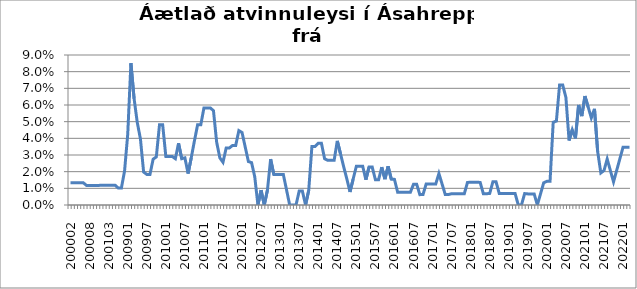
| Category | Series 0 |
|---|---|
| 200002 | 0.013 |
| 200003 | 0.013 |
| 200004 | 0.013 |
| 200005 | 0.013 |
| 200006 | 0.013 |
| 200007 | 0.012 |
| 200008 | 0.012 |
| 200010 | 0.012 |
| 200011 | 0.012 |
| 200012 | 0.012 |
| 200101 | 0.012 |
| 200102 | 0.012 |
| 200103 | 0.012 |
| 200104 | 0.012 |
| 200105 | 0.012 |
| 200810 | 0.01 |
| 200811 | 0.01 |
| 200812 | 0.02 |
| 200901 | 0.043 |
| 200902 | 0.085 |
| 200903 | 0.064 |
| 200904 | 0.05 |
| 200905 | 0.04 |
| 200906 | 0.02 |
| 200907 | 0.018 |
| 200908 | 0.018 |
| 200909 | 0.028 |
| 200910 | 0.029 |
| 200911 | 0.048 |
| 200912 | 0.048 |
| 201001 | 0.029 |
| 201002 | 0.029 |
| 201003 | 0.029 |
| 201004 | 0.028 |
| 201005 | 0.037 |
| 201006 | 0.028 |
| 201007 | 0.028 |
| 201008 | 0.019 |
| 201009 | 0.028 |
| 201010 | 0.038 |
| 201011 | 0.048 |
| 201012 | 0.048 |
| 201101 | 0.058 |
| 201102 | 0.058 |
| 201103 | 0.058 |
| 201104 | 0.057 |
| 201105 | 0.038 |
| 201106 | 0.028 |
| 201107 | 0.026 |
| 201108 | 0.034 |
| 201109 | 0.034 |
| 201110 | 0.036 |
| 201111 | 0.036 |
| 201112 | 0.045 |
| 201201 | 0.043 |
| 201202 | 0.035 |
| 201203 | 0.026 |
| 201204 | 0.025 |
| 201205 | 0.017 |
| 201206 | 0 |
| 201207 | 0.009 |
| 201208 | 0 |
| 201209 | 0.009 |
| 201210 | 0.028 |
| 201211 | 0.018 |
| 201212 | 0.018 |
| 201301 | 0.018 |
| 201302 | 0.018 |
| 201303 | 0.009 |
| 201304 | 0 |
| 201305 | 0 |
| 201306 | 0 |
| 201307 | 0.008 |
| 201308 | 0.008 |
| 201309 | 0 |
| 201310 | 0.009 |
| 201311 | 0.035 |
| 201312 | 0.035 |
| 201401 | 0.037 |
| 201402 | 0.037 |
| 201403 | 0.028 |
| 201404 | 0.027 |
| 201405 | 0.027 |
| 201406 | 0.027 |
| 201407 | 0.038 |
| 201408 | 0.031 |
| 201409 | 0.023 |
| 201410 | 0.016 |
| 201411 | 0.008 |
| 201412 | 0.016 |
| 201501 | 0.023 |
| 201502 | 0.023 |
| 201503 | 0.023 |
| 201504 | 0.015 |
| 201505 | 0.023 |
| 201506 | 0.023 |
| 201507 | 0.015 |
| 201508 | 0.015 |
| 201509 | 0.023 |
| 201510 | 0.016 |
| 201511 | 0.023 |
| 201512 | 0.016 |
| 201601 | 0.015 |
| 201602 | 0.008 |
| 201603 | 0.008 |
| 201604 | 0.008 |
| 201605 | 0.008 |
| 201606 | 0.008 |
| 201607 | 0.012 |
| 201608 | 0.012 |
| 201609 | 0.006 |
| 201610 | 0.006 |
| 201611 | 0.013 |
| 201612 | 0.013 |
| 201701 | 0.013 |
| 201702 | 0.013 |
| 201703 | 0.019 |
| 201704 | 0.013 |
| 201705 | 0.006 |
| 201706 | 0.006 |
| 201707 | 0.007 |
| 201708 | 0.007 |
| 201709 | 0.007 |
| 201710 | 0.007 |
| 201711 | 0.007 |
| 201712 | 0.014 |
| 201801 | 0.014 |
| 201802 | 0.014 |
| 201803 | 0.014 |
| 201804 | 0.014 |
| 201805 | 0.007 |
| 201806 | 0.007 |
| 201807 | 0.007 |
| 201808 | 0.014 |
| 201809 | 0.014 |
| 201810 | 0.007 |
| 201811 | 0.007 |
| 201812 | 0.007 |
| 201901 | 0.007 |
| 201902 | 0.007 |
| 201903 | 0.007 |
| 201904 | 0 |
| 201905 | 0 |
| 201906 | 0.007 |
| 201907 | 0.007 |
| 201908 | 0.007 |
| 201909 | 0.007 |
| 201910 | 0 |
| 201911 | 0.007 |
| 201912 | 0.013 |
| 202001 | 0.014 |
| 202002 | 0.014 |
| 202003 | 0.05 |
| 202004 | 0.05 |
| 202005 | 0.072 |
| 202006 | 0.072 |
| 202007 | 0.065 |
| 202008 | 0.039 |
| 202009 | 0.045 |
| 202010 | 0.04 |
| 202011 | 0.06 |
| 202012 | 0.053 |
| 202101 | 0.065 |
| 202102 | 0.059 |
| 202103 | 0.052 |
| 202104 | 0.058 |
| 202105 | 0.032 |
| 202106 | 0.019 |
| 202107 | 0.021 |
| 202108 | 0.028 |
| 202109 | 0.021 |
| 202110 | 0.014 |
| 202111 | 0.021 |
| 202112 | 0.028 |
| 202201 | 0.035 |
| 202202 | 0.035 |
| 202203 | 0.035 |